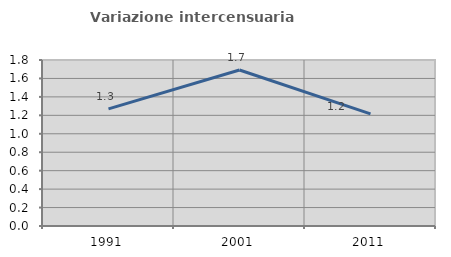
| Category | Variazione intercensuaria annua |
|---|---|
| 1991.0 | 1.27 |
| 2001.0 | 1.692 |
| 2011.0 | 1.215 |